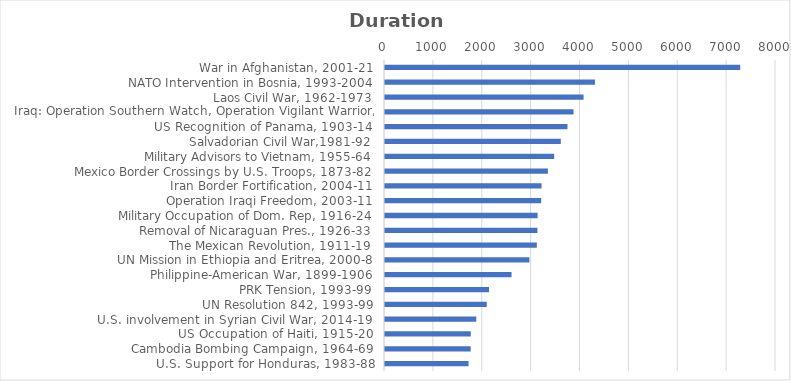
| Category | Duration |
|---|---|
| War in Afghanistan, 2001-21 | 7268 |
| NATO Intervention in Bosnia, 1993-2004 | 4296 |
| Laos Civil War, 1962-1973 | 4063 |
| Iraq: Operation Southern Watch, Operation Vigilant Warrior, Operation Provide Comfort I,II/ Operation Northern Watch | 3858 |
| US Recognition of Panama, 1903-14 | 3734 |
| Salvadorian Civil War,1981-92 | 3597 |
| Military Advisors to Vietnam, 1955-64 | 3461 |
| Mexico Border Crossings by U.S. Troops, 1873-82 | 3333 |
| Iran Border Fortification, 2004-11 | 3203 |
| Operation Iraqi Freedom, 2003-11 | 3196 |
| Military Occupation of Dom. Rep, 1916-24 | 3122 |
| Removal of Nicaraguan Pres., 1926-33 | 3119 |
| The Mexican Revolution, 1911-19 | 3106 |
| UN Mission in Ethiopia and Eritrea, 2000-8 | 2954 |
| Philippine-American War, 1899-1906 | 2589 |
| PRK Tension, 1993-99 | 2128 |
| UN Resolution 842, 1993-99 | 2082 |
| U.S. involvement in Syrian Civil War, 2014-19 | 1868 |
| US Occupation of Haiti, 1915-20 | 1755 |
| Cambodia Bombing Campaign, 1964-69 | 1753 |
| U.S. Support for Honduras, 1983-88 | 1710 |